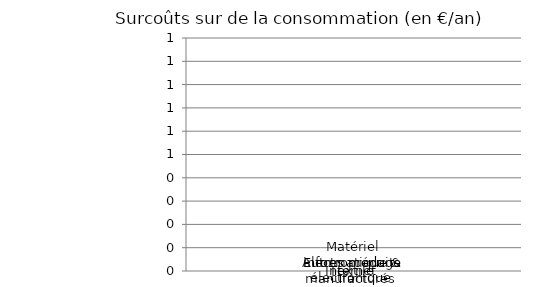
| Category | Matériel informatique & électronique  | Electroménager | Internet | Textile | Autres produits manufacturés  |
|---|---|---|---|---|---|
| 0 | 0 | 0 | 0 | 0 | 0 |